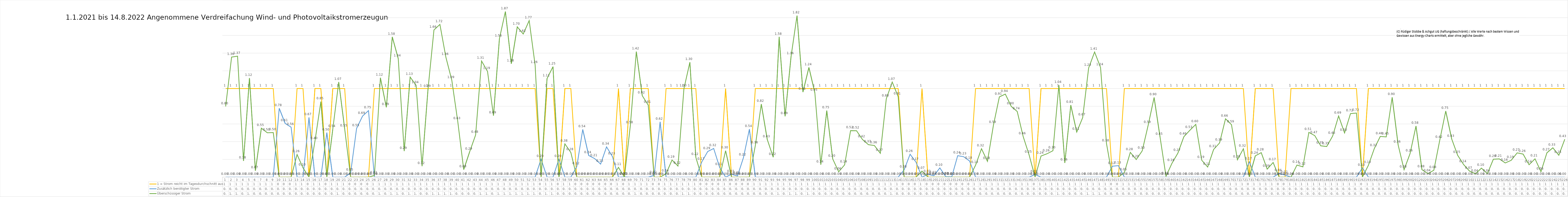
| Category | 1 = Strom reicht im Tagesdurchschnitt aus | Zusätzlich benötigter Strom | Überschüssiger Strom |
|---|---|---|---|
| 0 | 1 | 0 | 0.798 |
| 1 | 1 | 0 | 1.356 |
| 2 | 1 | 0 | 1.366 |
| 3 | 1 | 0 | 0.184 |
| 4 | 1 | 0 | 1.118 |
| 5 | 1 | 0 | 0.073 |
| 6 | 1 | 0 | 0.553 |
| 7 | 1 | 0 | 0.501 |
| 8 | 1 | 0 | 0.503 |
| 9 | 0 | 0.777 | 0 |
| 10 | 0 | 0.606 | 0 |
| 11 | 0 | 0.563 | 0 |
| 12 | 1 | 0 | 0.255 |
| 13 | 1 | 0 | 0.104 |
| 14 | 0 | 0.673 | 0 |
| 15 | 1 | 0 | 0.405 |
| 16 | 1 | 0 | 0.852 |
| 17 | 0 | 0.502 | 0 |
| 18 | 1 | 0 | 0.54 |
| 19 | 1 | 0 | 1.074 |
| 20 | 1 | 0 | 0.546 |
| 21 | 0 | 0.048 | 0 |
| 22 | 0 | 0.55 | 0 |
| 23 | 0 | 0.688 | 0 |
| 24 | 0 | 0.751 | 0 |
| 25 | 1 | 0 | 0.018 |
| 26 | 1 | 0 | 1.121 |
| 27 | 1 | 0 | 0.788 |
| 28 | 1 | 0 | 1.583 |
| 29 | 1 | 0 | 1.338 |
| 30 | 1 | 0 | 0.293 |
| 31 | 1 | 0 | 1.13 |
| 32 | 1 | 0 | 1.037 |
| 33 | 1 | 0 | 0.123 |
| 34 | 1 | 0 | 0.992 |
| 35 | 1 | 0 | 1.662 |
| 36 | 1 | 0 | 1.724 |
| 37 | 1 | 0 | 1.355 |
| 38 | 1 | 0 | 1.094 |
| 39 | 1 | 0 | 0.628 |
| 40 | 1 | 0 | 0.085 |
| 41 | 1 | 0 | 0.286 |
| 42 | 1 | 0 | 0.476 |
| 43 | 1 | 0 | 1.311 |
| 44 | 1 | 0 | 1.194 |
| 45 | 1 | 0 | 0.694 |
| 46 | 1 | 0 | 1.563 |
| 47 | 1 | 0 | 1.87 |
| 48 | 1 | 0 | 1.28 |
| 49 | 1 | 0 | 1.697 |
| 50 | 1 | 0 | 1.616 |
| 51 | 1 | 0 | 1.767 |
| 52 | 1 | 0 | 1.264 |
| 53 | 0 | 0.202 | 0 |
| 54 | 1 | 0 | 1.112 |
| 55 | 1 | 0 | 1.247 |
| 56 | 0 | 0.202 | 0 |
| 57 | 1 | 0 | 0.376 |
| 58 | 1 | 0 | 0.278 |
| 59 | 0 | 0.118 | 0 |
| 60 | 0 | 0.538 | 0 |
| 61 | 0 | 0.244 | 0 |
| 62 | 0 | 0.209 | 0 |
| 63 | 0 | 0.147 | 0 |
| 64 | 0 | 0.341 | 0 |
| 65 | 0 | 0.231 | 0 |
| 66 | 1 | 0 | 0.11 |
| 67 | 0 | 0.003 | 0 |
| 68 | 1 | 0 | 0.584 |
| 69 | 1 | 0 | 1.417 |
| 70 | 1 | 0 | 0.92 |
| 71 | 1 | 0 | 0.813 |
| 72 | 0 | 0.019 | 0 |
| 73 | 0 | 0.624 | 0 |
| 74 | 1 | 0 | 0.038 |
| 75 | 1 | 0 | 0.193 |
| 76 | 1 | 0 | 0.125 |
| 77 | 1 | 0 | 0.999 |
| 78 | 1 | 0 | 1.297 |
| 79 | 1 | 0 | 0.224 |
| 80 | 0 | 0.171 | 0 |
| 81 | 0 | 0.289 | 0 |
| 82 | 0 | 0.323 | 0 |
| 83 | 0 | 0.11 | 0 |
| 84 | 1 | 0 | 0.298 |
| 85 | 0 | 0.032 | 0 |
| 86 | 0 | 0.013 | 0 |
| 87 | 0 | 0.22 | 0 |
| 88 | 0 | 0.541 | 0 |
| 89 | 1 | 0 | 0.357 |
| 90 | 1 | 0 | 0.825 |
| 91 | 1 | 0 | 0.425 |
| 92 | 1 | 0 | 0.225 |
| 93 | 1 | 0 | 1.583 |
| 94 | 1 | 0 | 0.686 |
| 95 | 1 | 0 | 1.361 |
| 96 | 1 | 0 | 1.824 |
| 97 | 1 | 0 | 0.96 |
| 98 | 1 | 0 | 1.239 |
| 99 | 1 | 0 | 0.951 |
| 100 | 1 | 0 | 0.14 |
| 101 | 1 | 0 | 0.751 |
| 102 | 1 | 0 | 0.205 |
| 103 | 1 | 0 | 0.06 |
| 104 | 1 | 0 | 0.138 |
| 105 | 1 | 0 | 0.525 |
| 106 | 1 | 0 | 0.524 |
| 107 | 1 | 0 | 0.425 |
| 108 | 1 | 0 | 0.366 |
| 109 | 1 | 0 | 0.357 |
| 110 | 1 | 0 | 0.269 |
| 111 | 1 | 0 | 0.884 |
| 112 | 1 | 0 | 1.074 |
| 113 | 1 | 0 | 0.908 |
| 114 | 0 | 0.082 | 0 |
| 115 | 0 | 0.258 | 0 |
| 116 | 0 | 0.168 | 0 |
| 117 | 1 | 0 | 0.068 |
| 118 | 0 | 0.031 | 0 |
| 119 | 0 | 0.016 | 0 |
| 120 | 0 | 0.104 | 0 |
| 121 | 0 | 0.005 | 0 |
| 122 | 0 | 0.003 | 0 |
| 123 | 0 | 0.242 | 0 |
| 124 | 0 | 0.23 | 0 |
| 125 | 0 | 0.181 | 0 |
| 126 | 1 | 0 | 0.134 |
| 127 | 1 | 0 | 0.321 |
| 128 | 1 | 0 | 0.178 |
| 129 | 1 | 0 | 0.585 |
| 130 | 1 | 0 | 0.906 |
| 131 | 1 | 0 | 0.937 |
| 132 | 1 | 0 | 0.798 |
| 133 | 1 | 0 | 0.741 |
| 134 | 1 | 0 | 0.458 |
| 135 | 1 | 0 | 0.25 |
| 136 | 0 | 0.03 | 0 |
| 137 | 1 | 0 | 0.238 |
| 138 | 1 | 0 | 0.263 |
| 139 | 1 | 0 | 0.298 |
| 140 | 1 | 0 | 1.04 |
| 141 | 1 | 0 | 0.161 |
| 142 | 1 | 0 | 0.812 |
| 143 | 1 | 0 | 0.509 |
| 144 | 1 | 0 | 0.672 |
| 145 | 1 | 0 | 1.232 |
| 146 | 1 | 0 | 1.413 |
| 147 | 1 | 0 | 1.238 |
| 148 | 1 | 0 | 0.379 |
| 149 | 0 | 0.123 | 0 |
| 150 | 0 | 0.129 | 0 |
| 151 | 1 | 0 | 0.052 |
| 152 | 1 | 0 | 0.279 |
| 153 | 1 | 0 | 0.199 |
| 154 | 1 | 0 | 0.296 |
| 155 | 1 | 0 | 0.585 |
| 156 | 1 | 0 | 0.899 |
| 157 | 1 | 0 | 0.452 |
| 158 | 1 | 0 | 0.009 |
| 159 | 1 | 0 | 0.156 |
| 160 | 1 | 0 | 0.272 |
| 161 | 1 | 0 | 0.456 |
| 162 | 1 | 0 | 0.528 |
| 163 | 1 | 0 | 0.595 |
| 164 | 1 | 0 | 0.191 |
| 165 | 1 | 0 | 0.114 |
| 166 | 1 | 0 | 0.312 |
| 167 | 1 | 0 | 0.386 |
| 168 | 1 | 0 | 0.659 |
| 169 | 1 | 0 | 0.592 |
| 170 | 1 | 0 | 0.196 |
| 171 | 1 | 0 | 0.32 |
| 172 | 0 | 0.174 | 0 |
| 173 | 1 | 0 | 0.24 |
| 174 | 1 | 0 | 0.276 |
| 175 | 1 | 0 | 0.09 |
| 176 | 1 | 0 | 0.165 |
| 177 | 0 | 0.041 | 0 |
| 178 | 0 | 0.023 | 0 |
| 179 | 1 | 0 | 0 |
| 180 | 1 | 0 | 0.136 |
| 181 | 1 | 0 | 0.116 |
| 182 | 1 | 0 | 0.505 |
| 183 | 1 | 0 | 0.468 |
| 184 | 1 | 0 | 0.354 |
| 185 | 1 | 0 | 0.345 |
| 186 | 1 | 0 | 0.464 |
| 187 | 1 | 0 | 0.69 |
| 188 | 1 | 0 | 0.498 |
| 189 | 1 | 0 | 0.717 |
| 190 | 1 | 0 | 0.723 |
| 191 | 0 | 0.104 | 0 |
| 192 | 1 | 0 | 0.132 |
| 193 | 1 | 0 | 0.323 |
| 194 | 1 | 0 | 0.459 |
| 195 | 1 | 0 | 0.454 |
| 196 | 1 | 0 | 0.901 |
| 197 | 1 | 0 | 0.364 |
| 198 | 1 | 0 | 0.084 |
| 199 | 1 | 0 | 0.264 |
| 200 | 1 | 0 | 0.577 |
| 201 | 1 | 0 | 0.085 |
| 202 | 1 | 0 | 0.039 |
| 203 | 1 | 0 | 0.077 |
| 204 | 1 | 0 | 0.418 |
| 205 | 1 | 0 | 0.746 |
| 206 | 1 | 0 | 0.431 |
| 207 | 1 | 0 | 0.247 |
| 208 | 1 | 0 | 0.142 |
| 209 | 1 | 0 | 0.068 |
| 210 | 1 | 0 | 0.037 |
| 211 | 1 | 0 | 0.102 |
| 212 | 1 | 0 | 0.038 |
| 213 | 1 | 0 | 0.202 |
| 214 | 1 | 0 | 0.206 |
| 215 | 1 | 0 | 0.16 |
| 216 | 1 | 0 | 0.19 |
| 217 | 1 | 0 | 0.274 |
| 218 | 1 | 0 | 0.26 |
| 219 | 1 | 0 | 0.14 |
| 220 | 1 | 0 | 0.206 |
| 221 | 1 | 0 | 0.061 |
| 222 | 1 | 0 | 0.275 |
| 223 | 1 | 0 | 0.331 |
| 224 | 1 | 0 | 0.247 |
| 225 | 1 | 0 | 0.427 |